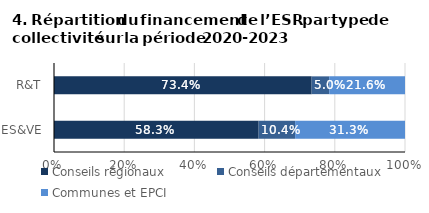
| Category | Conseils régionaux | Conseils départementaux | Communes et EPCI |
|---|---|---|---|
| ES&VE | 0.583 | 0.104 | 0.313 |
| R&T | 0.734 | 0.05 | 0.216 |